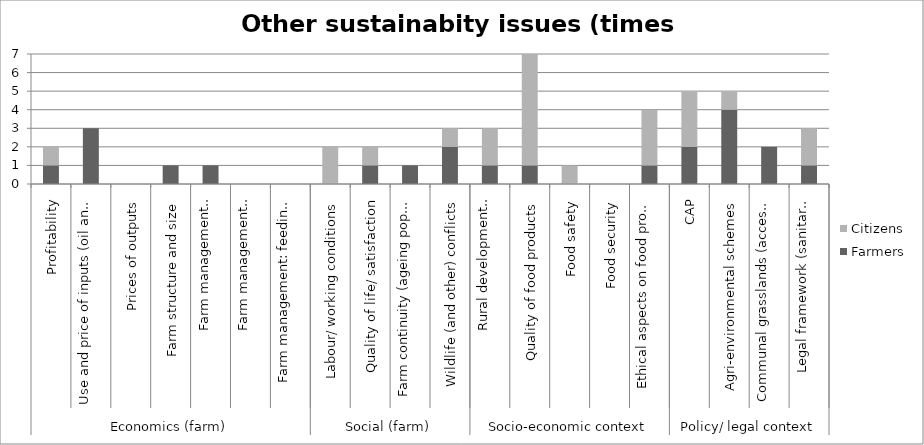
| Category | Farmers | Citizens |
|---|---|---|
| 0 | 1 | 1 |
| 1 | 3 | 0 |
| 2 | 0 | 0 |
| 3 | 1 | 0 |
| 4 | 1 | 0 |
| 5 | 0 | 0 |
| 6 | 0 | 0 |
| 7 | 0 | 2 |
| 8 | 1 | 1 |
| 9 | 1 | 0 |
| 10 | 2 | 1 |
| 11 | 1 | 2 |
| 12 | 1 | 6 |
| 13 | 0 | 1 |
| 14 | 0 | 0 |
| 15 | 1 | 3 |
| 16 | 2 | 3 |
| 17 | 4 | 1 |
| 18 | 2 | 0 |
| 19 | 1 | 2 |